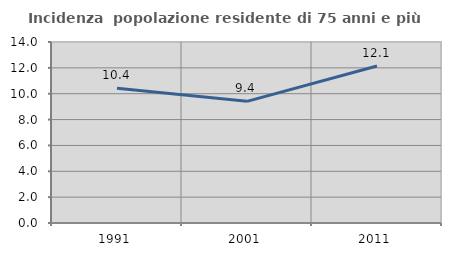
| Category | Incidenza  popolazione residente di 75 anni e più |
|---|---|
| 1991.0 | 10.417 |
| 2001.0 | 9.409 |
| 2011.0 | 12.143 |